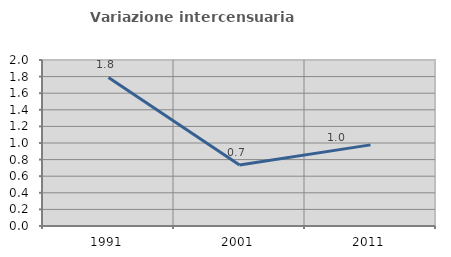
| Category | Variazione intercensuaria annua |
|---|---|
| 1991.0 | 1.79 |
| 2001.0 | 0.734 |
| 2011.0 | 0.977 |